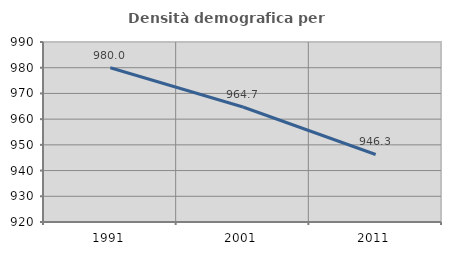
| Category | Densità demografica |
|---|---|
| 1991.0 | 980.007 |
| 2001.0 | 964.726 |
| 2011.0 | 946.256 |